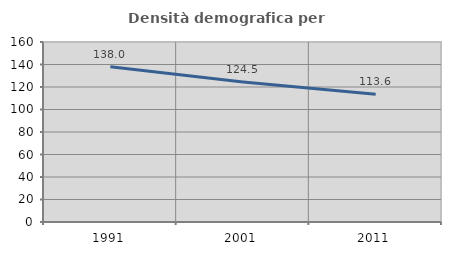
| Category | Densità demografica |
|---|---|
| 1991.0 | 137.991 |
| 2001.0 | 124.511 |
| 2011.0 | 113.64 |